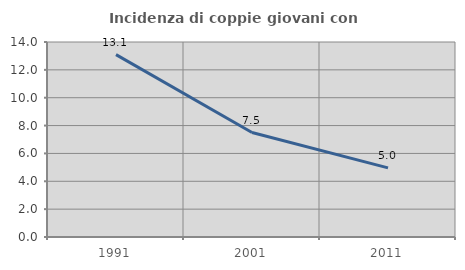
| Category | Incidenza di coppie giovani con figli |
|---|---|
| 1991.0 | 13.091 |
| 2001.0 | 7.5 |
| 2011.0 | 4.965 |